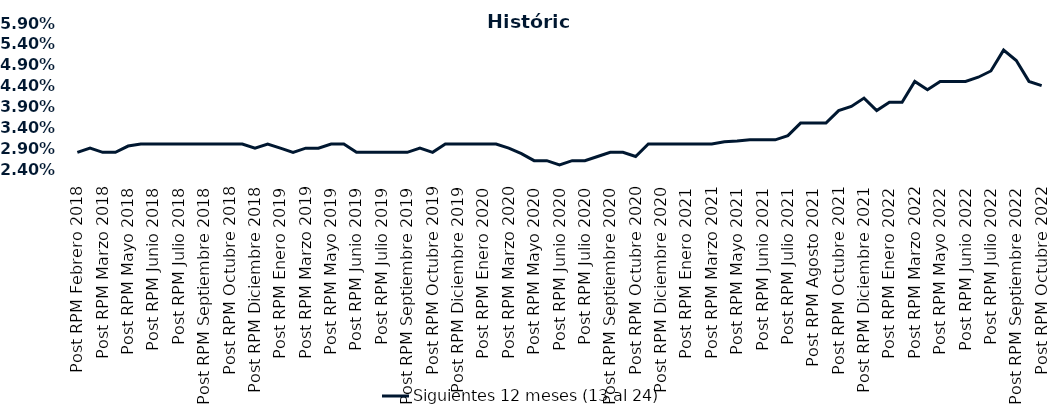
| Category | Siguientes 12 meses (13 al 24)  |
|---|---|
| Post RPM Febrero 2018 | 0.028 |
| Pre RPM Marzo 2018 | 0.029 |
| Post RPM Marzo 2018 | 0.028 |
| Pre RPM Mayo 2018 | 0.028 |
| Post RPM Mayo 2018 | 0.03 |
| Pre RPM Junio 2018 | 0.03 |
| Post RPM Junio 2018 | 0.03 |
| Pre RPM Julio 2018 | 0.03 |
| Post RPM Julio 2018 | 0.03 |
| Pre RPM Septiembre 2018 | 0.03 |
| Post RPM Septiembre 2018 | 0.03 |
| Pre RPM Octubre 2018 | 0.03 |
| Post RPM Octubre 2018 | 0.03 |
| Pre RPM Diciembre 2018 | 0.03 |
| Post RPM Diciembre 2018 | 0.029 |
| Pre RPM Enero 2019 | 0.03 |
| Post RPM Enero 2019 | 0.029 |
| Pre RPM Marzo 2019 | 0.028 |
| Post RPM Marzo 2019 | 0.029 |
| Pre RPM Mayo 2019 | 0.029 |
| Post RPM Mayo 2019 | 0.03 |
| Pre RPM Junio 2019 | 0.03 |
| Post RPM Junio 2019 | 0.028 |
| Pre RPM Julio 2019 | 0.028 |
| Post RPM Julio 2019 | 0.028 |
| Pre RPM Septiembre 2019 | 0.028 |
| Post RPM Septiembre 2019 | 0.028 |
| Pre RPM Octubre 2019 | 0.029 |
| Post RPM Octubre 2019 | 0.028 |
| Pre RPM Diciembre 2019 | 0.03 |
| Post RPM Diciembre 2019 | 0.03 |
| Pre RPM Enero 2020 | 0.03 |
| Post RPM Enero 2020 | 0.03 |
| Pre RPM Marzo 2020 | 0.03 |
| Post RPM Marzo 2020 | 0.029 |
| Pre RPM Mayo 2020 | 0.028 |
| Post RPM Mayo 2020 | 0.026 |
| Pre RPM Junio 2020 | 0.026 |
| Post RPM Junio 2020 | 0.025 |
| Pre RPM Julio 2020 | 0.026 |
| Post RPM Julio 2020 | 0.026 |
| Pre RPM Septiembre 2020 | 0.027 |
| Post RPM Septiembre 2020 | 0.028 |
| Pre RPM Octubre 2020 | 0.028 |
| Post RPM Octubre 2020 | 0.027 |
| Pre RPM Diciembre 2020 | 0.03 |
| Post RPM Diciembre 2020 | 0.03 |
| Pre RPM Enero 2021 | 0.03 |
| Post RPM Enero 2021 | 0.03 |
| Pre RPM Marzo 2021 | 0.03 |
| Post RPM Marzo 2021 | 0.03 |
| Pre RPM Mayo 2021 | 0.031 |
| Post RPM Mayo 2021 | 0.031 |
| Pre RPM Junio 2021 | 0.031 |
| Post RPM Junio 2021 | 0.031 |
| Pre RPM Julio 2021 | 0.031 |
| Post RPM Julio 2021 | 0.032 |
| Pre RPM Agosto 2021 | 0.035 |
| Post RPM Agosto 2021 | 0.035 |
| Pre RPM Octubre 2021 | 0.035 |
| Post RPM Octubre 2021 | 0.038 |
| Pre RPM Diciembre 2021 | 0.039 |
| Post RPM Diciembre 2021 | 0.041 |
| Pre RPM Enero 2022 | 0.038 |
| Post RPM Enero 2022 | 0.04 |
| Pre RPM Marzo 2022 | 0.04 |
| Post RPM Marzo 2022 | 0.045 |
| Pre RPM Mayo 2022 | 0.043 |
| Post RPM Mayo 2022 | 0.045 |
| Pre RPM Junio 2022 | 0.045 |
| Post RPM Junio 2022 | 0.045 |
| Pre RPM Julio 2022 | 0.046 |
| Post RPM Julio 2022 | 0.048 |
| Pre RPM Septiembre 2022 | 0.052 |
| Post RPM Septiembre 2022 | 0.05 |
| Pre RPM Octubre 2022 | 0.045 |
| Post RPM Octubre 2022 | 0.044 |